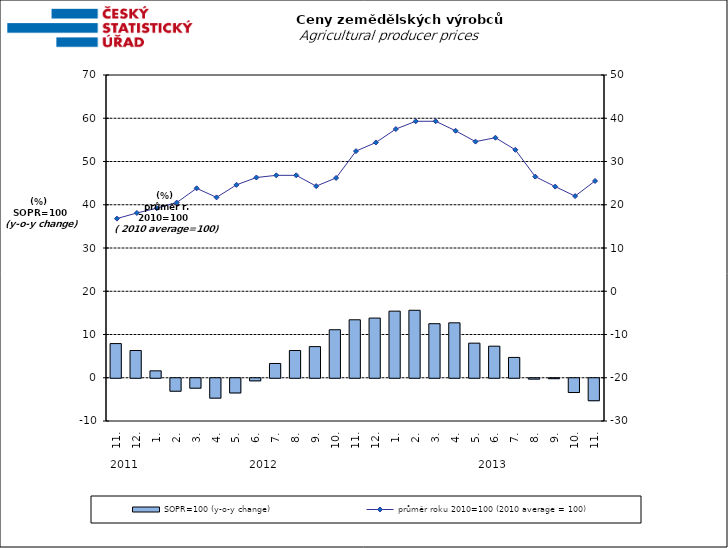
| Category | SOPR=100 (y-o-y change)   |
|---|---|
| 0 | 7.9 |
| 1 | 6.3 |
| 2 | 1.6 |
| 3 | -3 |
| 4 | -2.3 |
| 5 | -4.6 |
| 6 | -3.4 |
| 7 | -0.6 |
| 8 | 3.3 |
| 9 | 6.3 |
| 10 | 7.2 |
| 11 | 11.1 |
| 12 | 13.4 |
| 13 | 13.8 |
| 14 | 15.4 |
| 15 | 15.6 |
| 16 | 12.5 |
| 17 | 12.7 |
| 18 | 8 |
| 19 | 7.3 |
| 20 | 4.7 |
| 21 | -0.2 |
| 22 | -0.1 |
| 23 | -3.3 |
| 24 | -5.2 |